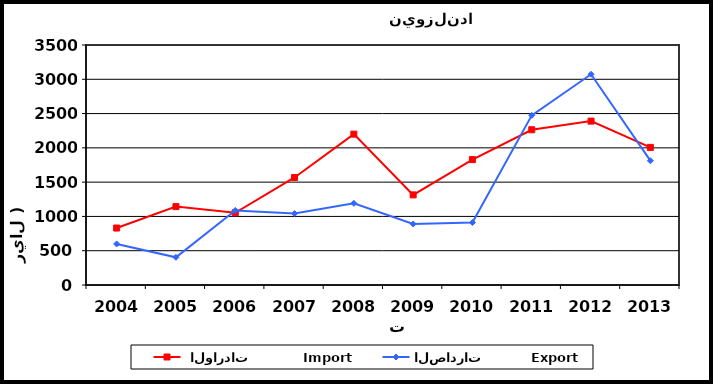
| Category |  الواردات           Import | الصادرات          Export |
|---|---|---|
| 2004.0 | 831 | 599 |
| 2005.0 | 1143 | 404 |
| 2006.0 | 1053 | 1087 |
| 2007.0 | 1568 | 1042 |
| 2008.0 | 2200 | 1191 |
| 2009.0 | 1314 | 890 |
| 2010.0 | 1829 | 911 |
| 2011.0 | 2264 | 2474 |
| 2012.0 | 2390 | 3073 |
| 2013.0 | 2007 | 1813 |